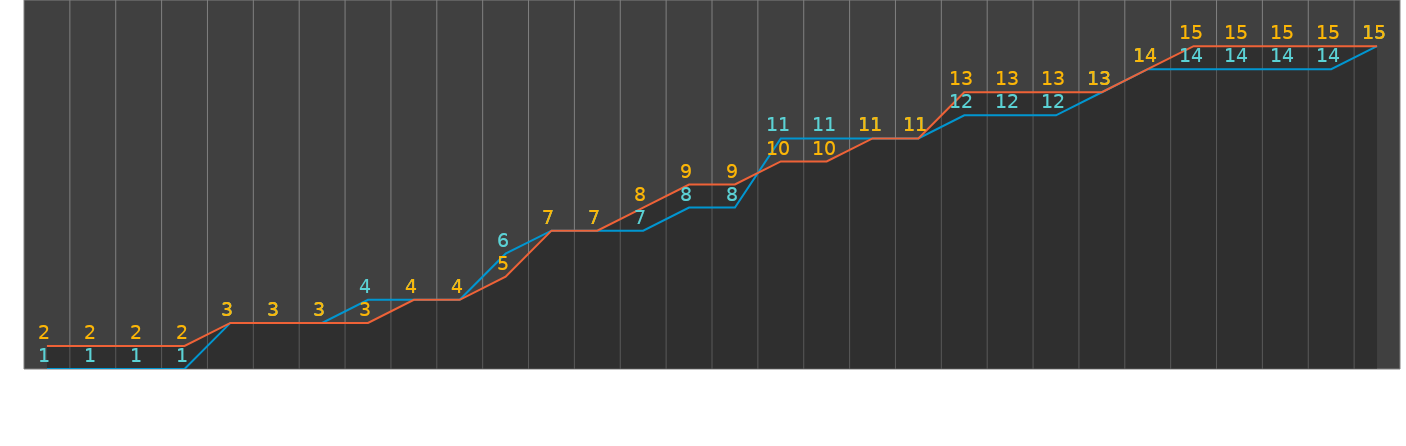
| Category | Opened | Closed | Opened Lables | Closed Labels |
|---|---|---|---|---|
| 5/1/18 | 0 | 1 | 0.56 | 1.56 |
| 5/2/18 | 0 | 1 | 0.56 | 1.56 |
| 5/3/18 | 0 | 1 | 0.56 | 1.56 |
| 5/4/18 | 0 | 1 | 0.56 | 1.56 |
| 5/5/18 | 2 | 2 | 2.56 | 2.56 |
| 5/6/18 | 2 | 2 | 2.56 | 2.56 |
| 5/7/18 | 2 | 2 | 2.56 | 2.56 |
| 5/8/18 | 3 | 2 | 3.56 | 2.56 |
| 5/9/18 | 3 | 3 | 3.56 | 3.56 |
| 5/10/18 | 3 | 3 | 3.56 | 3.56 |
| 5/11/18 | 5 | 4 | 5.56 | 4.56 |
| 5/12/18 | 6 | 6 | 6.56 | 6.56 |
| 5/13/18 | 6 | 6 | 6.56 | 6.56 |
| 5/14/18 | 6 | 7 | 6.56 | 7.56 |
| 5/15/18 | 7 | 8 | 7.56 | 8.56 |
| 5/16/18 | 7 | 8 | 7.56 | 8.56 |
| 5/17/18 | 10 | 9 | 10.56 | 9.56 |
| 5/18/18 | 10 | 9 | 10.56 | 9.56 |
| 5/19/18 | 10 | 10 | 10.56 | 10.56 |
| 5/20/18 | 10 | 10 | 10.56 | 10.56 |
| 5/21/18 | 11 | 12 | 11.56 | 12.56 |
| 5/22/18 | 11 | 12 | 11.56 | 12.56 |
| 5/23/18 | 11 | 12 | 11.56 | 12.56 |
| 5/24/18 | 12 | 12 | 12.56 | 12.56 |
| 5/25/18 | 13 | 13 | 13.56 | 13.56 |
| 5/26/18 | 13 | 14 | 13.56 | 14.56 |
| 5/27/18 | 13 | 14 | 13.56 | 14.56 |
| 5/28/18 | 13 | 14 | 13.56 | 14.56 |
| 5/29/18 | 13 | 14 | 13.56 | 14.56 |
| 5/30/18 | 14 | 14 | 14.56 | 14.56 |